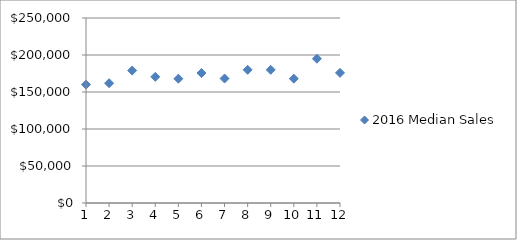
| Category | 2016 Median Sales |
|---|---|
| 1.0 | 160000 |
| 2.0 | 161900 |
| 3.0 | 179000 |
| 4.0 | 170500 |
| 5.0 | 168000 |
| 6.0 | 175600 |
| 7.0 | 168200 |
| 8.0 | 180000 |
| 9.0 | 180000 |
| 10.0 | 168000 |
| 11.0 | 195000 |
| 12.0 | 175875 |